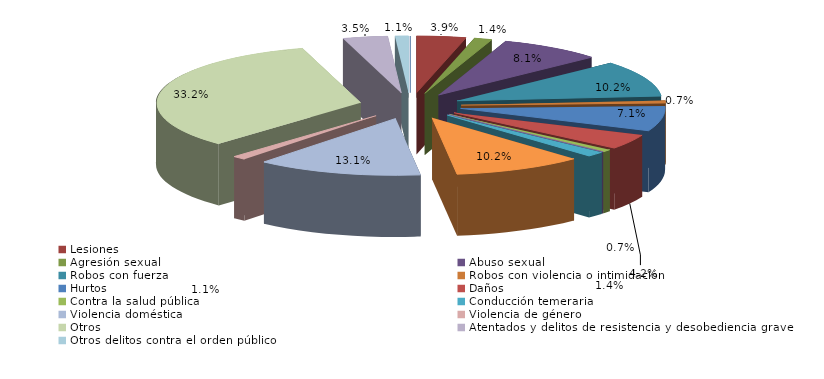
| Category | Series 0 |
|---|---|
| Homicidio/Asesinato dolosos | 0 |
| Lesiones | 11 |
| Agresión sexual | 4 |
| Abuso sexual | 23 |
| Robos con fuerza | 29 |
| Robos con violencia o intimidación | 2 |
| Hurtos | 20 |
| Daños | 12 |
| Contra la salud pública | 2 |
| Conduccción etílica/drogas | 0 |
| Conducción temeraria | 4 |
| Conducción sin permiso | 29 |
| Violencia doméstica | 37 |
| Violencia de género | 3 |
| Otros | 94 |
| Atentados y delitos de resistencia y desobediencia grave | 10 |
| Otros delitos contra el orden público | 3 |